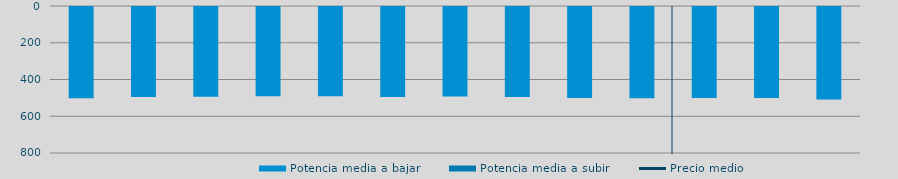
| Category | Potencia media a bajar | Potencia media a subir |
|---|---|---|
| 0 | 496.176 |  |
| 1 | 490.249 |  |
| 2 | 488.138 |  |
| 3 | 485.047 |  |
| 4 | 485.731 |  |
| 5 | 489.157 |  |
| 6 | 487.01 |  |
| 7 | 490.333 |  |
| 8 | 495.342 |  |
| 9 | 496.882 |  |
| 10 | 495.707 |  |
| 11 | 494.878 |  |
| 12 | 503.953 |  |